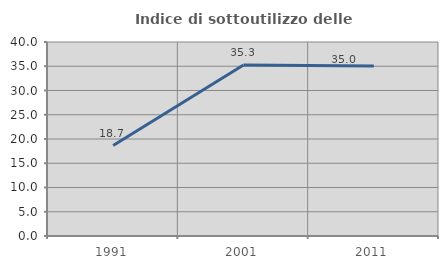
| Category | Indice di sottoutilizzo delle abitazioni  |
|---|---|
| 1991.0 | 18.658 |
| 2001.0 | 35.274 |
| 2011.0 | 35.03 |